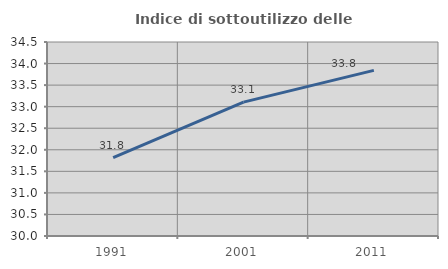
| Category | Indice di sottoutilizzo delle abitazioni  |
|---|---|
| 1991.0 | 31.818 |
| 2001.0 | 33.105 |
| 2011.0 | 33.842 |